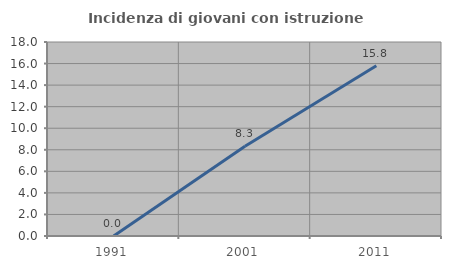
| Category | Incidenza di giovani con istruzione universitaria |
|---|---|
| 1991.0 | 0 |
| 2001.0 | 8.333 |
| 2011.0 | 15.789 |